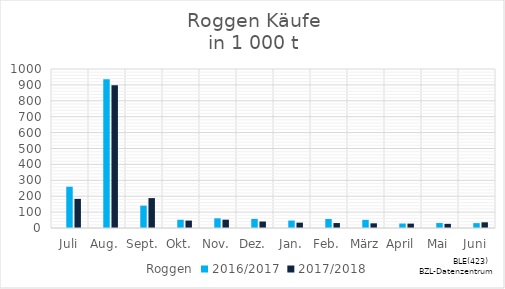
| Category | Roggen | 2016/2017 | 2017/2018 |
|---|---|---|---|
| Juli |  | 259.609 | 183.056 |
| Aug. |  | 935.143 | 897.315 |
| Sept. |  | 140.608 | 188.005 |
| Okt. |  | 51.817 | 46.632 |
| Nov. |  | 60.825 | 52.246 |
| Dez. |  | 57.135 | 40.768 |
| Jan. |  | 46.92 | 33.574 |
| Feb. |  | 56.432 | 31.181 |
| März |  | 51.215 | 29.522 |
| April |  | 28.276 | 27.695 |
| Mai |  | 31.171 | 26.247 |
| Juni |  | 30.657 | 35.788 |